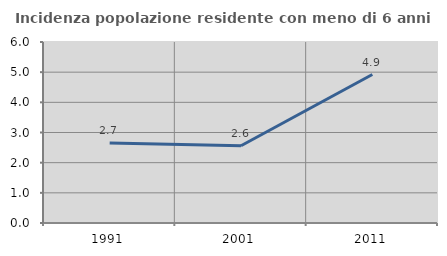
| Category | Incidenza popolazione residente con meno di 6 anni |
|---|---|
| 1991.0 | 2.653 |
| 2001.0 | 2.559 |
| 2011.0 | 4.921 |